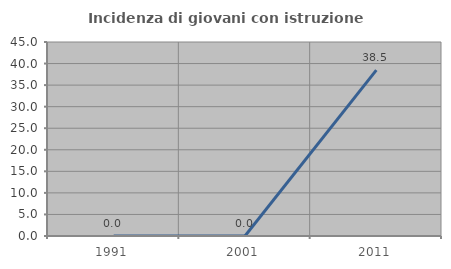
| Category | Incidenza di giovani con istruzione universitaria |
|---|---|
| 1991.0 | 0 |
| 2001.0 | 0 |
| 2011.0 | 38.462 |